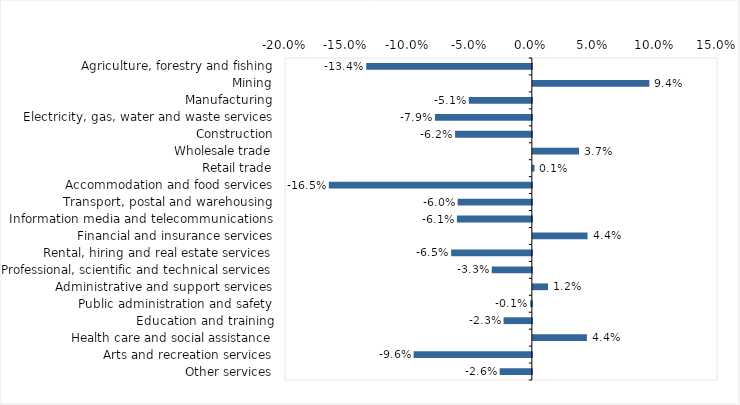
| Category | This week |
|---|---|
| Agriculture, forestry and fishing | -0.134 |
| Mining | 0.094 |
| Manufacturing | -0.051 |
| Electricity, gas, water and waste services | -0.078 |
| Construction | -0.062 |
| Wholesale trade | 0.037 |
| Retail trade | 0.001 |
| Accommodation and food services | -0.164 |
| Transport, postal and warehousing | -0.06 |
| Information media and telecommunications | -0.061 |
| Financial and insurance services | 0.044 |
| Rental, hiring and real estate services | -0.065 |
| Professional, scientific and technical services | -0.032 |
| Administrative and support services | 0.012 |
| Public administration and safety | -0.001 |
| Education and training | -0.023 |
| Health care and social assistance | 0.044 |
| Arts and recreation services | -0.096 |
| Other services | -0.026 |